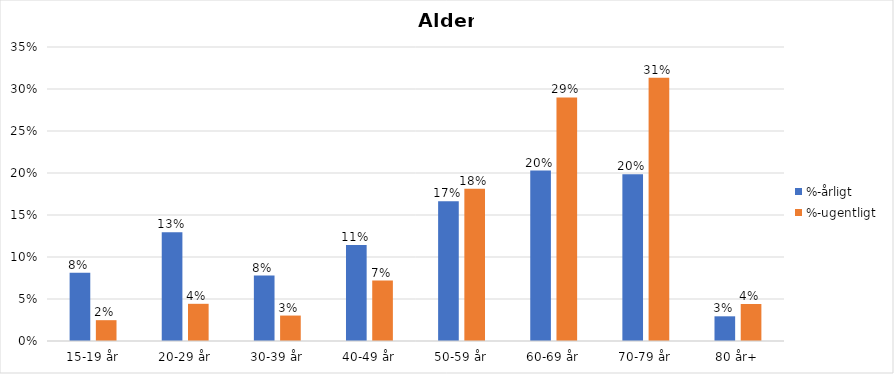
| Category | %-årligt | %-ugentligt |
|---|---|---|
| 15-19 år | 0.081 | 0.025 |
| 20-29 år | 0.129 | 0.044 |
| 30-39 år | 0.078 | 0.03 |
| 40-49 år | 0.114 | 0.072 |
| 50-59 år | 0.166 | 0.181 |
| 60-69 år | 0.203 | 0.29 |
| 70-79 år | 0.198 | 0.313 |
| 80 år+ | 0.029 | 0.044 |